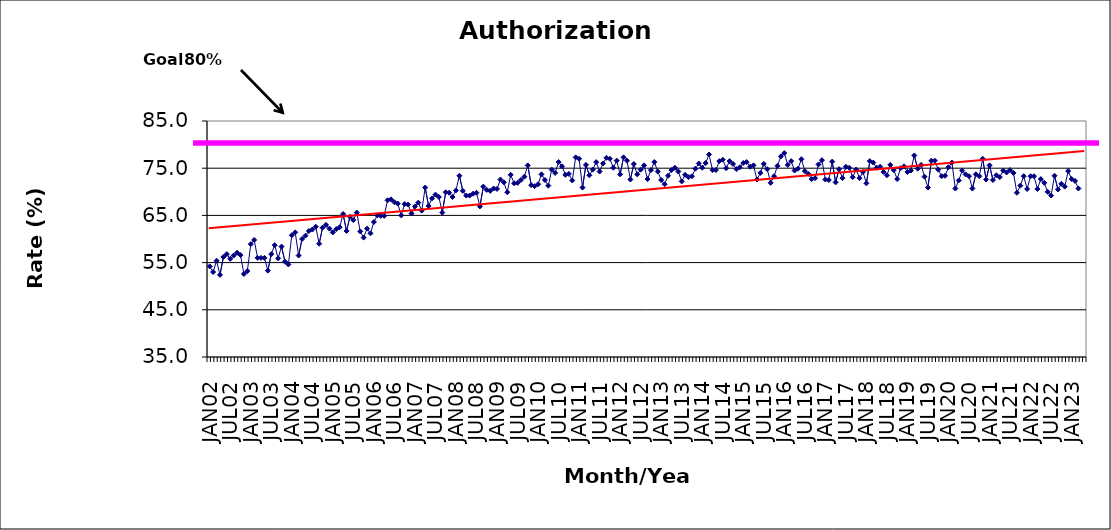
| Category | Series 0 |
|---|---|
| JAN02 | 54.2 |
| FEB02 | 53 |
| MAR02 | 55.4 |
| APR02 | 52.4 |
| MAY02 | 56.2 |
| JUN02 | 56.8 |
| JUL02 | 55.8 |
| AUG02 | 56.5 |
| SEP02 | 57.1 |
| OCT02 | 56.6 |
| NOV02 | 52.6 |
| DEC02 | 53.2 |
| JAN03 | 58.9 |
| FEB03 | 59.8 |
| MAR03 | 56 |
| APR03 | 56 |
| MAY03 | 56 |
| JUN03 | 53.3 |
| JUL03 | 56.8 |
| AUG03 | 58.7 |
| SEP03 | 55.9 |
| OCT03 | 58.4 |
| NOV03 | 55.2 |
| DEC03 | 54.6 |
| JAN04 | 60.8 |
| FEB04 | 61.4 |
| MAR04 | 56.5 |
| APR04 | 60 |
| MAY04 | 60.7 |
| JUN04 | 61.7 |
| JUL04 | 62 |
| AUG04 | 62.6 |
| SEP04 | 59 |
| OCT04 | 62.4 |
| NOV04 | 63 |
| DEC04 | 62.2 |
| JAN05 | 61.4 |
| FEB05 | 62.1 |
| MAR05 | 62.5 |
| APR05 | 65.3 |
| MAY05 | 61.7 |
| JUN05 | 64.7 |
| JUL05 | 64 |
| AUG05 | 65.6 |
| SEP05 | 61.6 |
| OCT05 | 60.3 |
| NOV05 | 62.2 |
| DEC05 | 61.2 |
| JAN06 | 63.6 |
| FEB06 | 65 |
| MAR06 | 64.9 |
| APR06 | 64.9 |
| MAY06 | 68.2 |
| JUN06 | 68.4 |
| JUL06 | 67.8 |
| AUG06 | 67.5 |
| SEP06 | 65 |
| OCT06 | 67.4 |
| NOV06 | 67.3 |
| DEC06 | 65.4 |
| JAN07 | 66.9 |
| FEB07 | 67.7 |
| MAR07 | 66 |
| APR07 | 70.9 |
| MAY07 | 67 |
| JUN07 | 68.6 |
| JUL07 | 69.4 |
| AUG07 | 68.9 |
| SEP07 | 65.6 |
| OCT07 | 69.9 |
| NOV07 | 69.8 |
| DEC07 | 68.9 |
| JAN08 | 70.3 |
| FEB08 | 73.4 |
| MAR08 | 70.2 |
| APR08 | 69.2 |
| MAY08 | 69.2 |
| JUN08 | 69.6 |
| JUL08 | 69.8 |
| AUG08 | 66.9 |
| SEP08 | 71.1 |
| OCT08 | 70.4 |
| NOV08 | 70.2 |
| DEC08 | 70.7 |
| JAN09 | 70.6 |
| FEB09 | 72.6 |
| MAR09 | 72 |
| APR09 | 69.9 |
| MAY09 | 73.6 |
| JUN09 | 71.8 |
| JUL09 | 71.9 |
| AUG09 | 72.5 |
| SEP09 | 73.2 |
| OCT09 | 75.6 |
| NOV09 | 71.4 |
| DEC09 | 71.2 |
| JAN10 | 71.6 |
| FEB10 | 73.7 |
| MAR10 | 72.5 |
| APR10 | 71.3 |
| MAY10 | 74.7 |
| JUN10 | 74 |
| JUL10 | 76.3 |
| AUG10 | 75.4 |
| SEP10 | 73.6 |
| OCT10 | 73.8 |
| NOV10 | 72.4 |
| DEC10 | 77.3 |
| JAN11 | 77 |
| FEB11 | 70.9 |
| MAR11 | 75.7 |
| APR11 | 73.5 |
| MAY11 | 74.7 |
| JUN11 | 76.3 |
| JUL11 | 74.3 |
| AUG11 | 76 |
| SEP11 | 77.2 |
| OCT11 | 77 |
| NOV11 | 75.1 |
| DEC11 | 76.6 |
| JAN12 | 73.7 |
| FEB12 | 77.3 |
| MAR12 | 76.6 |
| APR12 | 72.6 |
| MAY12 | 75.9 |
| JUN12 | 73.7 |
| JUL12 | 74.7 |
| AUG12 | 75.6 |
| SEP12 | 72.7 |
| OCT12 | 74.6 |
| NOV12 | 76.3 |
| DEC12 | 74.3 |
| JAN13 | 72.5 |
| FEB13 | 71.6 |
| MAR13 | 73.4 |
| APR13 | 74.6 |
| MAY13 | 75.1 |
| JUN13 | 74.3 |
| JUL13 | 72.2 |
| AUG13 | 73.6 |
| SEP13 | 73.1 |
| OCT13 | 73.3 |
| NOV13 | 74.9 |
| DEC13 | 76 |
| JAN14 | 75.1 |
| FEB14 | 76.1 |
| MAR14 | 77.9 |
| APR14 | 74.6 |
| MAY14 | 74.6 |
| JUN14 | 76.5 |
| JUL14 | 76.8 |
| AUG14 | 75 |
| SEP14 | 76.5 |
| OCT14 | 75.9 |
| NOV14 | 74.8 |
| DEC14 | 75.2 |
| JAN15 | 76.1 |
| FEB15 | 76.3 |
| MAR15 | 75.3 |
| APR15 | 75.6 |
| MAY15 | 72.6 |
| JUN15 | 74 |
| JUL15 | 75.9 |
| AUG15 | 74.8 |
| SEP15 | 71.9 |
| OCT15 | 73.3 |
| NOV15 | 75.5 |
| DEC15 | 77.5 |
| JAN16 | 78.2 |
| FEB16 | 75.7 |
| MAR16 | 76.5 |
| APR16 | 74.5 |
| MAY16 | 74.9 |
| JUN16 | 76.9 |
| JUL16 | 74.4 |
| AUG16 | 73.8 |
| SEP16 | 72.7 |
| OCT16 | 72.9 |
| NOV16 | 75.8 |
| DEC16 | 76.7 |
| JAN17 | 72.6 |
| FEB17 | 72.5 |
| MAR17 | 76.4 |
| APR17 | 72 |
| MAY17 | 74.8 |
| JUN17 | 72.9 |
| JUL17 | 75.3 |
| AUG17 | 75.1 |
| SEP17 | 73.1 |
| OCT17 | 74.7 |
| NOV17 | 72.9 |
| DEC17 | 74.2 |
| JAN18 | 71.8 |
| FEB18 | 76.5 |
| MAR18 | 76.2 |
| APR18 | 75.1 |
| MAY18 | 75.3 |
| JUN18 | 74.2 |
| JUL18 | 73.5 |
| AUG18 | 75.7 |
| SEP18 | 74.6 |
| OCT18 | 72.7 |
| NOV18 | 75 |
| DEC18 | 75.4 |
| JAN19 | 74.2 |
| FEB19 | 74.5 |
| MAR19 | 77.7 |
| APR19 | 74.9 |
| MAY19 | 75.7 |
| JUN19 | 73.2 |
| JUL19 | 70.9 |
| AUG19 | 76.6 |
| SEP19 | 76.6 |
| OCT19 | 74.7 |
| NOV19 | 73.3 |
| DEC19 | 73.4 |
| JAN20 | 75.2 |
| FEB20 | 76.2 |
| MAR20 | 70.7 |
| APR20 | 72.4 |
| MAY20 | 74.5 |
| JUN20 | 73.7 |
| JUL20 | 73.3 |
| AUG20 | 70.7 |
| SEP20 | 73.7 |
| OCT20 | 73.3 |
| NOV20 | 77 |
| DEC20 | 72.6 |
| JAN21 | 75.6 |
| FEB21 | 72.5 |
| MAR21 | 73.5 |
| APR21 | 73.1 |
| MAY21 | 74.5 |
| JUN21 | 74.1 |
| JUL21 | 74.6 |
| AUG21 | 74 |
| SEP21 | 69.8 |
| OCT21 | 71.3 |
| NOV21 | 73.3 |
| DEC21 | 70.6 |
| JAN22 | 73.3 |
| FEB22 | 73.3 |
| MAR22 | 70.6 |
| APR22 | 72.7 |
| MAY22 | 71.9 |
| JUN22 | 70 |
| JUL22 | 69.2 |
| AUG22 | 73.4 |
| SEP22 | 70.5 |
| OCT22 | 71.7 |
| NOV22 | 71.1 |
| DEC22 | 74.4 |
| JAN23 | 72.7 |
| FEB23 | 72.3 |
| MAR23 | 70.7 |